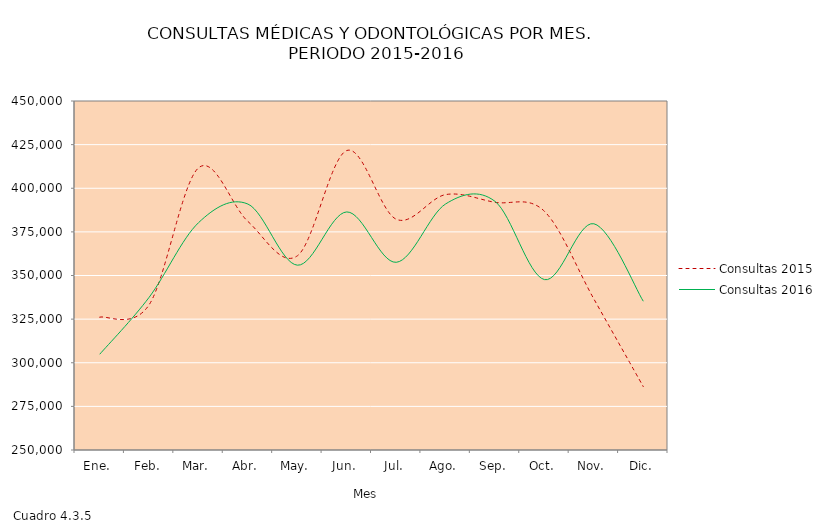
| Category | Consultas 2015 | Consultas 2016 |
|---|---|---|
| Ene. | 326122 | 304864 |
| Feb. | 333214 | 337506 |
| Mar. | 411698 | 380282 |
| Abr. | 380947 | 390928 |
| May. | 361291 | 355916 |
| Jun. | 421633 | 386433 |
| Jul. | 382250 | 357565 |
| Ago. | 396363 | 391010 |
| Sep. | 391937 | 392474 |
| Oct. | 386769 | 347639 |
| Nov. | 336537 | 379656 |
| Dic. | 286313 | 335255 |